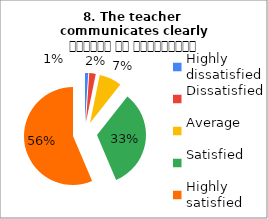
| Category | 8. The teacher 
communicates clearly शिक्षक का सम्प्रेषण सुस्पष्ट है |
|---|---|
| Highly dissatisfied | 1 |
| Dissatisfied | 2 |
| Average | 7 |
| Satisfied | 31 |
| Highly satisfied | 53 |